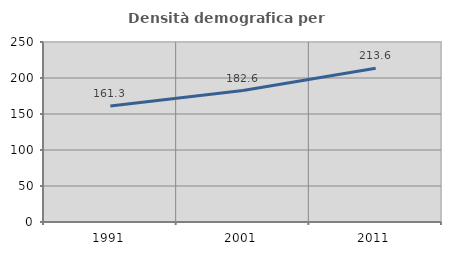
| Category | Densità demografica |
|---|---|
| 1991.0 | 161.268 |
| 2001.0 | 182.555 |
| 2011.0 | 213.626 |